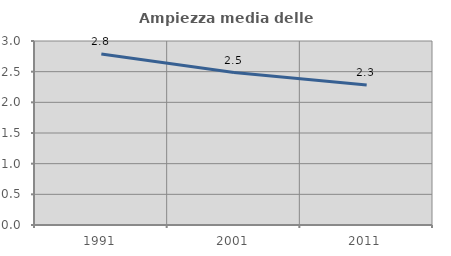
| Category | Ampiezza media delle famiglie |
|---|---|
| 1991.0 | 2.79 |
| 2001.0 | 2.486 |
| 2011.0 | 2.281 |